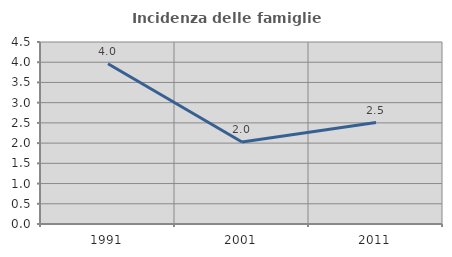
| Category | Incidenza delle famiglie numerose |
|---|---|
| 1991.0 | 3.963 |
| 2001.0 | 2.026 |
| 2011.0 | 2.509 |